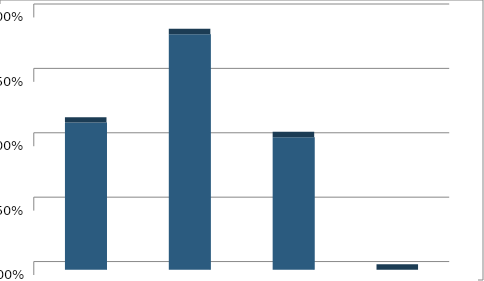
| Category | Series1 |
|---|---|
| Alternative Future #1:  Low Intensity | 0.286 |
| Alternative Future #2:  Medium Intensity | 0.457 |
| Alternative Future #3:  High Intensity | 0.257 |
| None of the Above | 0 |